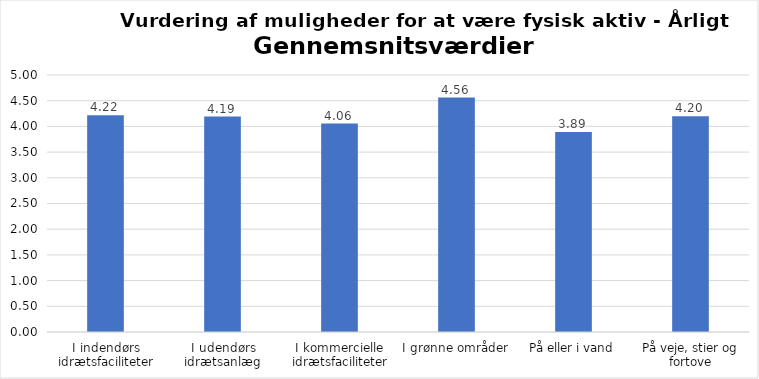
| Category | Gennemsnit |
|---|---|
| I indendørs idrætsfaciliteter | 4.215 |
| I udendørs idrætsanlæg | 4.192 |
| I kommercielle idrætsfaciliteter | 4.056 |
| I grønne områder | 4.562 |
| På eller i vand | 3.893 |
| På veje, stier og fortove | 4.2 |